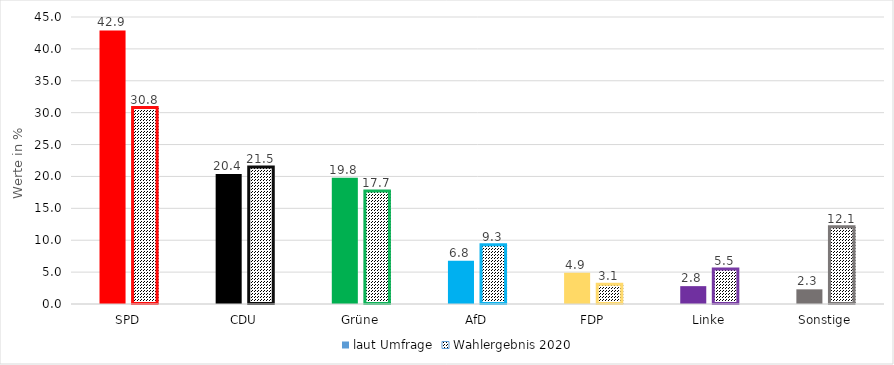
| Category | laut Umfrage | Wahlergebnis 2020 |
|---|---|---|
| SPD | 42.9 | 30.8 |
| CDU | 20.4 | 21.5 |
| Grüne | 19.8 | 17.7 |
| AfD | 6.8 | 9.3 |
| FDP | 4.9 | 3.1 |
| Linke | 2.8 | 5.5 |
| Sonstige | 2.3 | 12.1 |